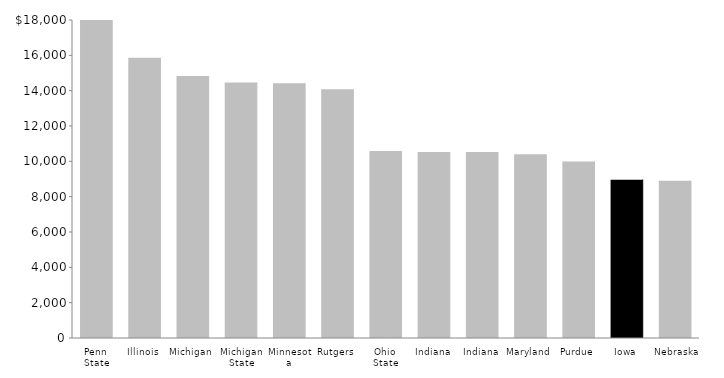
| Category | Series 0 |
|---|---|
| Penn State | 18436 |
| Illinois | 15868 |
| Michigan | 14826 |
| Michigan State | 14460 |
| Minnesota | 14417 |
| Rutgers | 14085 |
| Ohio State | 10591 |
| Indiana | 10533 |
| Indiana | 10533 |
| Maryland | 10399 |
| Purdue | 9992 |
| Iowa | 8964 |
| Nebraska | 8901 |